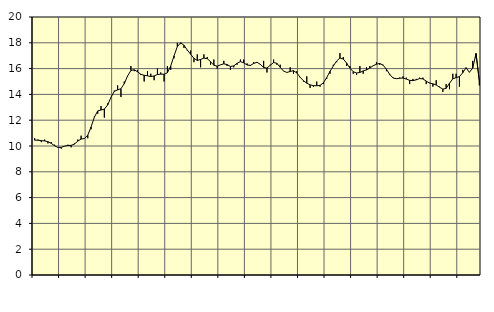
| Category | Piggar | Series 1 |
|---|---|---|
| nan | 10.6 | 10.45 |
| 87.0 | 10.5 | 10.45 |
| 87.0 | 10.3 | 10.42 |
| 87.0 | 10.5 | 10.39 |
| nan | 10.2 | 10.34 |
| 88.0 | 10.3 | 10.2 |
| 88.0 | 10.1 | 10.02 |
| 88.0 | 9.9 | 9.89 |
| nan | 9.8 | 9.89 |
| 89.0 | 10 | 9.99 |
| 89.0 | 10.1 | 10.04 |
| 89.0 | 9.9 | 10.05 |
| nan | 10.2 | 10.15 |
| 90.0 | 10.5 | 10.38 |
| 90.0 | 10.8 | 10.54 |
| 90.0 | 10.6 | 10.58 |
| nan | 10.6 | 10.84 |
| 91.0 | 11.3 | 11.47 |
| 91.0 | 12.3 | 12.24 |
| 91.0 | 12.5 | 12.72 |
| nan | 13.1 | 12.79 |
| 92.0 | 12.2 | 12.86 |
| 92.0 | 13.3 | 13.18 |
| 92.0 | 13.8 | 13.78 |
| nan | 14.3 | 14.24 |
| 93.0 | 14.7 | 14.35 |
| 93.0 | 13.8 | 14.44 |
| 93.0 | 15 | 14.83 |
| nan | 15.4 | 15.43 |
| 94.0 | 16.2 | 15.85 |
| 94.0 | 15.8 | 15.91 |
| 94.0 | 15.9 | 15.75 |
| nan | 15.5 | 15.56 |
| 95.0 | 15 | 15.48 |
| 95.0 | 15.8 | 15.44 |
| 95.0 | 15.6 | 15.38 |
| nan | 15.1 | 15.43 |
| 96.0 | 16 | 15.54 |
| 96.0 | 15.7 | 15.57 |
| 96.0 | 15 | 15.56 |
| nan | 16.2 | 15.68 |
| 97.0 | 15.9 | 16.2 |
| 97.0 | 16.8 | 16.99 |
| 97.0 | 18 | 17.71 |
| nan | 17.9 | 18 |
| 98.0 | 17.6 | 17.81 |
| 98.0 | 17.4 | 17.44 |
| 98.0 | 17.4 | 17.11 |
| nan | 16.5 | 16.8 |
| 99.0 | 17.1 | 16.63 |
| 99.0 | 16.1 | 16.71 |
| 99.0 | 17.1 | 16.81 |
| nan | 16.9 | 16.77 |
| 0.0 | 16.3 | 16.54 |
| 0.0 | 16.7 | 16.26 |
| 0.0 | 16 | 16.19 |
| nan | 16.3 | 16.29 |
| 1.0 | 16.6 | 16.37 |
| 1.0 | 16.2 | 16.31 |
| 1.0 | 15.9 | 16.17 |
| nan | 16.1 | 16.21 |
| 2.0 | 16.3 | 16.41 |
| 2.0 | 16.7 | 16.54 |
| 2.0 | 16.7 | 16.45 |
| nan | 16.4 | 16.28 |
| 3.0 | 16.2 | 16.25 |
| 3.0 | 16.5 | 16.4 |
| 3.0 | 16.5 | 16.49 |
| nan | 16.3 | 16.33 |
| 4.0 | 16.6 | 16.09 |
| 4.0 | 15.7 | 16.04 |
| 4.0 | 16.3 | 16.26 |
| nan | 16.7 | 16.47 |
| 5.0 | 16.3 | 16.41 |
| 5.0 | 16.3 | 16.1 |
| 5.0 | 15.8 | 15.81 |
| nan | 15.7 | 15.7 |
| 6.0 | 16.1 | 15.78 |
| 6.0 | 15.6 | 15.84 |
| 6.0 | 15.8 | 15.66 |
| nan | 15.3 | 15.33 |
| 7.0 | 15 | 15.06 |
| 7.0 | 15.4 | 14.87 |
| 7.0 | 14.5 | 14.74 |
| nan | 14.6 | 14.68 |
| 8.0 | 15 | 14.67 |
| 8.0 | 14.6 | 14.7 |
| 8.0 | 14.8 | 14.89 |
| nan | 15.2 | 15.3 |
| 9.0 | 15.6 | 15.79 |
| 9.0 | 16.3 | 16.2 |
| 9.0 | 16.5 | 16.59 |
| nan | 17.2 | 16.82 |
| 10.0 | 16.9 | 16.74 |
| 10.0 | 16.2 | 16.43 |
| 10.0 | 16.2 | 16.04 |
| nan | 15.6 | 15.76 |
| 11.0 | 15.5 | 15.66 |
| 11.0 | 16.2 | 15.7 |
| 11.0 | 15.6 | 15.82 |
| nan | 16.1 | 15.9 |
| 12.0 | 16.2 | 16.04 |
| 12.0 | 16.2 | 16.22 |
| 12.0 | 16.5 | 16.34 |
| nan | 16.3 | 16.4 |
| 13.0 | 16.3 | 16.26 |
| 13.0 | 15.8 | 15.95 |
| 13.0 | 15.5 | 15.55 |
| nan | 15.3 | 15.27 |
| 14.0 | 15.2 | 15.22 |
| 14.0 | 15.3 | 15.25 |
| 14.0 | 15.4 | 15.27 |
| nan | 15.3 | 15.19 |
| 15.0 | 14.8 | 15.09 |
| 15.0 | 15.2 | 15.07 |
| 15.0 | 15.2 | 15.13 |
| nan | 15.3 | 15.23 |
| 16.0 | 15.3 | 15.2 |
| 16.0 | 14.8 | 15.03 |
| 16.0 | 14.9 | 14.88 |
| nan | 14.6 | 14.82 |
| 17.0 | 15.1 | 14.73 |
| 17.0 | 14.6 | 14.56 |
| 17.0 | 14.2 | 14.41 |
| nan | 14.8 | 14.47 |
| 18.0 | 14.4 | 14.86 |
| 18.0 | 15.6 | 15.21 |
| 18.0 | 15.6 | 15.3 |
| nan | 14.6 | 15.38 |
| 19.0 | 15.9 | 15.68 |
| 19.0 | 16 | 16.07 |
| 19.0 | 15.7 | 15.71 |
| nan | 16.6 | 16.04 |
| 20.0 | 16.8 | 17.17 |
| 20.0 | 14.7 | 15.04 |